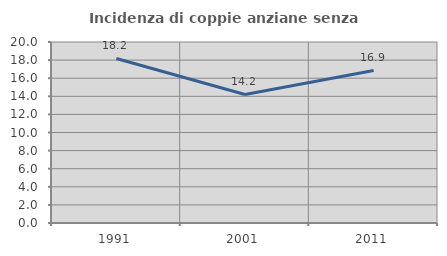
| Category | Incidenza di coppie anziane senza figli  |
|---|---|
| 1991.0 | 18.182 |
| 2001.0 | 14.199 |
| 2011.0 | 16.86 |